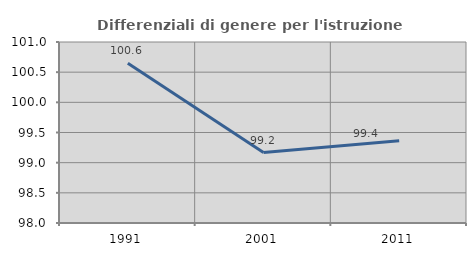
| Category | Differenziali di genere per l'istruzione superiore |
|---|---|
| 1991.0 | 100.647 |
| 2001.0 | 99.167 |
| 2011.0 | 99.365 |